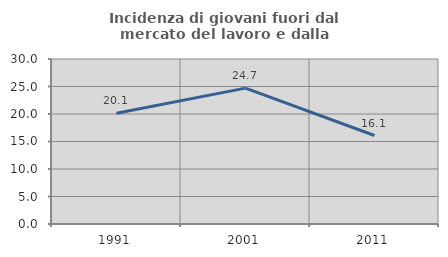
| Category | Incidenza di giovani fuori dal mercato del lavoro e dalla formazione  |
|---|---|
| 1991.0 | 20.132 |
| 2001.0 | 24.706 |
| 2011.0 | 16.09 |